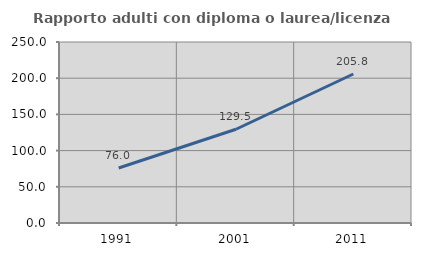
| Category | Rapporto adulti con diploma o laurea/licenza media  |
|---|---|
| 1991.0 | 76.023 |
| 2001.0 | 129.511 |
| 2011.0 | 205.825 |